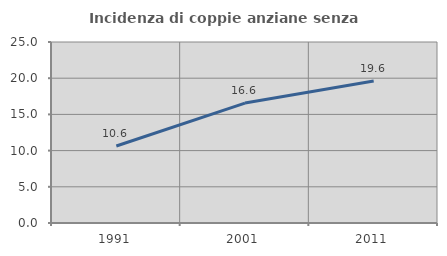
| Category | Incidenza di coppie anziane senza figli  |
|---|---|
| 1991.0 | 10.632 |
| 2001.0 | 16.566 |
| 2011.0 | 19.619 |